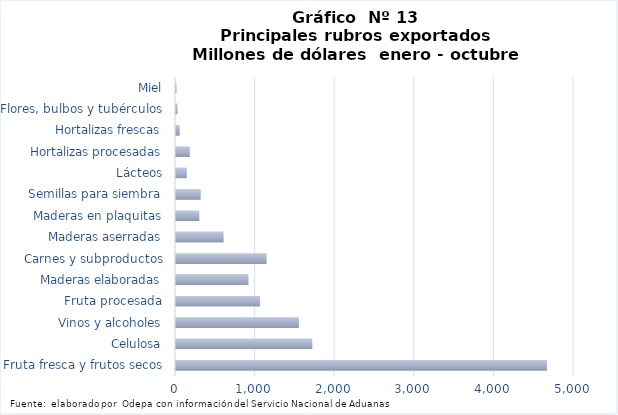
| Category | Series 7 |
|---|---|
| Fruta fresca y frutos secos | 4660348.396 |
| Celulosa | 1712438.224 |
| Vinos y alcoholes | 1543904.711 |
| Fruta procesada | 1054614.523 |
| Maderas elaboradas | 910550.454 |
| Carnes y subproductos | 1137930.615 |
| Maderas aserradas | 597638.68 |
| Maderas en plaquitas | 293280.033 |
| Semillas para siembra | 309769.066 |
| Lácteos | 135205.082 |
| Hortalizas procesadas | 174022.902 |
| Hortalizas frescas | 47299.22 |
| Flores, bulbos y tubérculos | 18683.517 |
| Miel | 5820.402 |